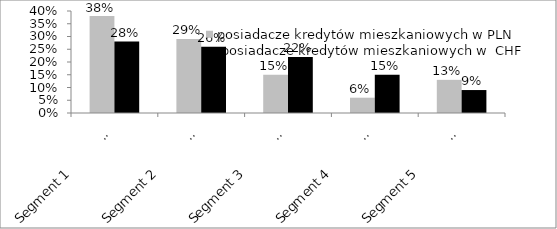
| Category | posiadacze kredytów mieszkaniowych w PLN |  posiadacze kredytów mieszkaniowych w  CHF |
|---|---|---|
| Segment 1                     Zdystansowani | 0.38 | 0.28 |
| Segment 2                     Bezkrytyczni | 0.29 | 0.26 |
| Segment 3                     Aspirujący | 0.15 | 0.22 |
| Segment 4                     Zagubieni | 0.06 | 0.15 |
| Segment 5                     Hazardziści | 0.13 | 0.09 |